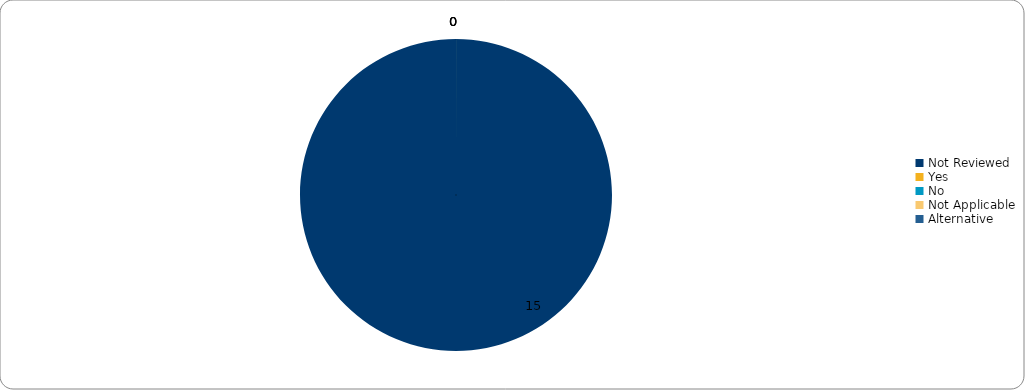
| Category | Counts |
|---|---|
| Not Reviewed | 15 |
| Yes | 0 |
| No | 0 |
| Not Applicable | 0 |
| Alternative | 0 |